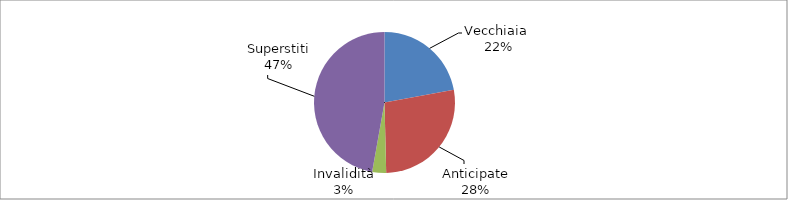
| Category | Series 0 |
|---|---|
| Vecchiaia  | 8819 |
| Anticipate | 10964 |
| Invalidità | 1274 |
| Superstiti | 18815 |